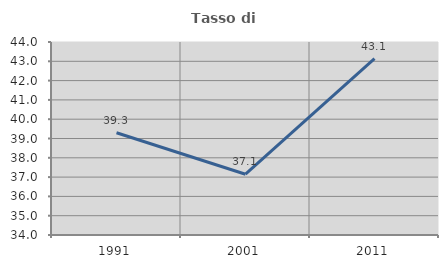
| Category | Tasso di occupazione   |
|---|---|
| 1991.0 | 39.296 |
| 2001.0 | 37.15 |
| 2011.0 | 43.14 |